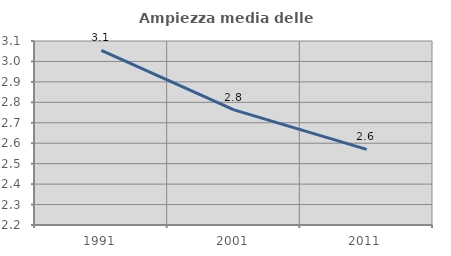
| Category | Ampiezza media delle famiglie |
|---|---|
| 1991.0 | 3.054 |
| 2001.0 | 2.763 |
| 2011.0 | 2.57 |